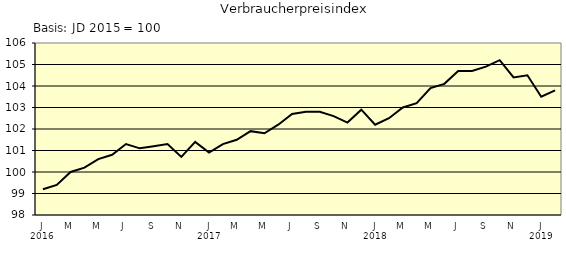
| Category | Series 0 |
|---|---|
| 0 | 99.2 |
| 1 | 99.4 |
| 2 | 100 |
| 3 | 100.2 |
| 4 | 100.6 |
| 5 | 100.8 |
| 6 | 101.3 |
| 7 | 101.1 |
| 8 | 101.2 |
| 9 | 101.3 |
| 10 | 100.7 |
| 11 | 101.4 |
| 12 | 100.9 |
| 13 | 101.3 |
| 14 | 101.5 |
| 15 | 101.9 |
| 16 | 101.8 |
| 17 | 102.2 |
| 18 | 102.7 |
| 19 | 102.8 |
| 20 | 102.8 |
| 21 | 102.6 |
| 22 | 102.3 |
| 23 | 102.9 |
| 24 | 102.2 |
| 25 | 102.5 |
| 26 | 103 |
| 27 | 103.2 |
| 28 | 103.9 |
| 29 | 104.1 |
| 30 | 104.7 |
| 31 | 104.7 |
| 32 | 104.9 |
| 33 | 105.2 |
| 34 | 104.4 |
| 35 | 104.5 |
| 36 | 103.5 |
| 37 | 103.8 |